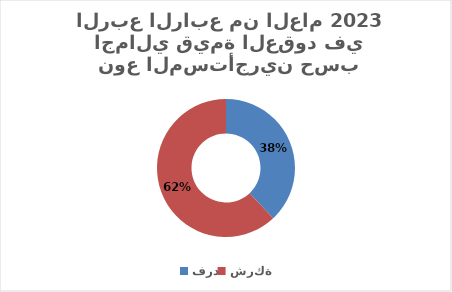
| Category | Series 0 |
|---|---|
| فرد | 0.38 |
| شركة | 0.62 |